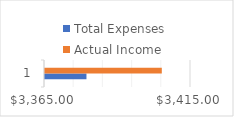
| Category | Total Expenses | Actual Income |
|---|---|---|
| 0 | 3379.2 | 3405 |